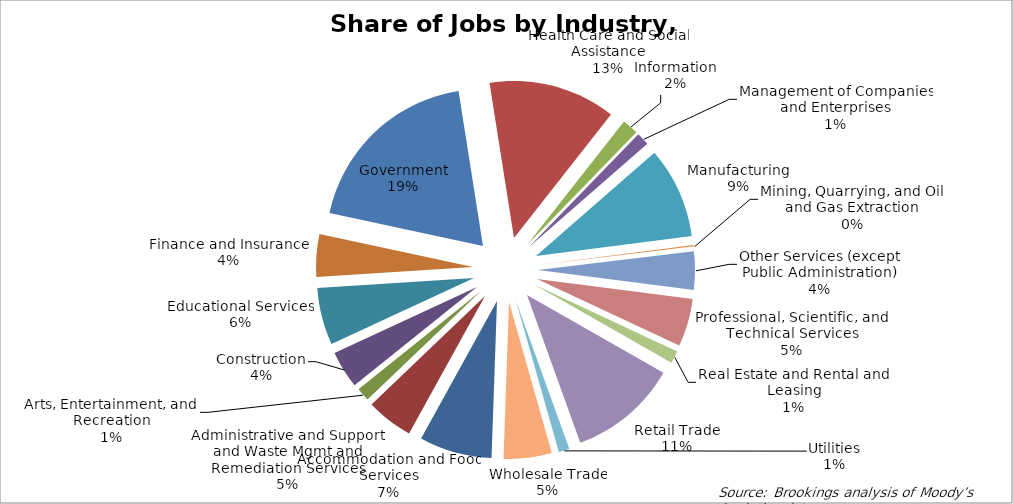
| Category | Syracuse |
|---|---|
| Accommodation and Food Services | 0.071 |
| Administrative and Support and Waste Mgmt and Remediation Services | 0.046 |
| Arts, Entertainment, and Recreation | 0.013 |
| Construction | 0.037 |
| Educational Services | 0.056 |
| Finance and Insurance | 0.042 |
| Government | 0.183 |
| Health Care and Social Assistance | 0.125 |
| Information | 0.016 |
| Management of Companies and Enterprises | 0.013 |
| Manufacturing | 0.09 |
| Mining, Quarrying, and Oil and Gas Extraction | 0.001 |
| Other Services (except Public Administration) | 0.038 |
| Professional, Scientific, and Technical Services | 0.047 |
| Real Estate and Rental and Leasing | 0.012 |
| Retail Trade | 0.108 |
| Utilities | 0.011 |
| Wholesale Trade | 0.047 |